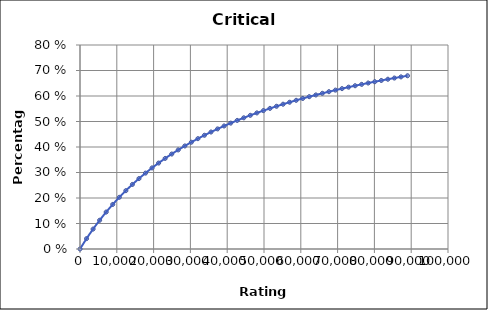
| Category | Critical Defence |
|---|---|
| 0.0 | 0 |
| 1780.0 | 0.041 |
| 3560.0 | 0.078 |
| 5340.0 | 0.113 |
| 7120.0 | 0.145 |
| 8900.0 | 0.175 |
| 10680.0 | 0.203 |
| 12460.0 | 0.229 |
| 14240.0 | 0.253 |
| 16020.0 | 0.276 |
| 17800.0 | 0.298 |
| 19580.0 | 0.318 |
| 21360.0 | 0.337 |
| 23140.0 | 0.355 |
| 24920.0 | 0.372 |
| 26700.0 | 0.389 |
| 28480.0 | 0.404 |
| 30260.0 | 0.419 |
| 32040.0 | 0.433 |
| 33820.0 | 0.446 |
| 35600.0 | 0.459 |
| 37380.0 | 0.471 |
| 39160.0 | 0.483 |
| 40940.0 | 0.494 |
| 42720.0 | 0.504 |
| 44500.0 | 0.514 |
| 46280.0 | 0.524 |
| 48060.0 | 0.534 |
| 49840.0 | 0.543 |
| 51620.0 | 0.551 |
| 53400.0 | 0.56 |
| 55180.0 | 0.568 |
| 56960.0 | 0.576 |
| 58740.0 | 0.583 |
| 60520.0 | 0.59 |
| 62300.0 | 0.597 |
| 64080.0 | 0.604 |
| 65860.0 | 0.611 |
| 67640.0 | 0.617 |
| 69420.0 | 0.623 |
| 71200.0 | 0.629 |
| 72980.0 | 0.635 |
| 74760.0 | 0.64 |
| 76540.0 | 0.646 |
| 78320.0 | 0.651 |
| 80100.0 | 0.656 |
| 81880.0 | 0.661 |
| 83660.0 | 0.666 |
| 85440.0 | 0.67 |
| 87220.0 | 0.675 |
| 89000.0 | 0.679 |